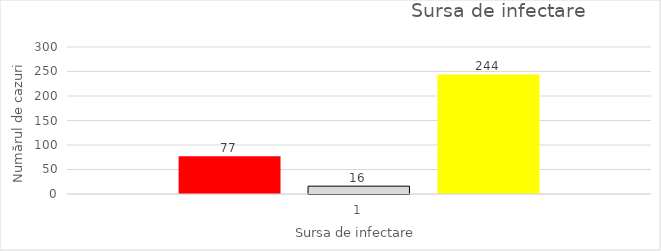
| Category | Series 0 | Series 1 | Series 2 |
|---|---|---|---|
| 0 | 77 | 16 | 244 |